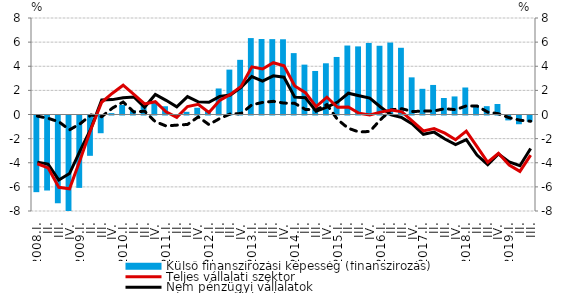
| Category | Külső finanszírozási képesség (finanszírozás) |
|---|---|
| 2008.I. | -6.355 |
| II. | -6.219 |
| III. | -7.276 |
| IV. | -7.935 |
| 2009.I. | -6.001 |
| II. | -3.343 |
| III. | -1.47 |
| IV. | 0.115 |
| 2010.I. | 0.792 |
| II. | 0.344 |
| III. | 0.702 |
| IV. | 1.096 |
| 2011.I. | 0.683 |
| II. | -0.086 |
| III. | 0.222 |
| IV. | 0.56 |
| 2012.I. | 0.348 |
| II. | 2.157 |
| III. | 3.721 |
| IV. | 4.532 |
| 2013.I. | 6.335 |
| II. | 6.261 |
| III. | 6.249 |
| IV. | 6.237 |
| 2014.I. | 5.089 |
| II. | 4.134 |
| III. | 3.609 |
| IV. | 4.246 |
| 2015.I. | 4.77 |
| II. | 5.718 |
| III. | 5.646 |
| IV. | 5.932 |
| 2016.I. | 5.699 |
| II. | 5.964 |
| III. | 5.531 |
| IV. | 3.079 |
| 2017.I. | 2.129 |
| II. | 2.45 |
| III. | 1.368 |
| IV. | 1.498 |
| 2018.I. | 2.239 |
| II. | 0.762 |
| III. | 0.692 |
| IV. | 0.873 |
| 2019.I. | -0.406 |
| II. | -0.725 |
| III. | -0.515 |